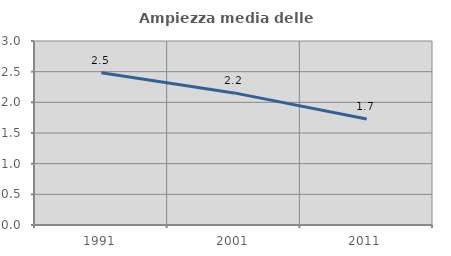
| Category | Ampiezza media delle famiglie |
|---|---|
| 1991.0 | 2.483 |
| 2001.0 | 2.154 |
| 2011.0 | 1.727 |